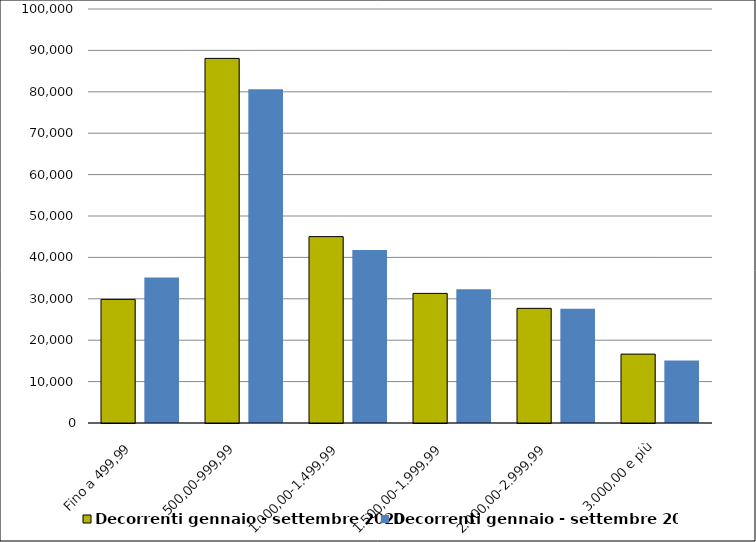
| Category | Decorrenti gennaio - settembre 2020 | Decorrenti gennaio - settembre 2019 |
|---|---|---|
| Fino a 499,99 | 29861 | 35146 |
| 500,00-999,99 | 88069 | 80629 |
| 1.000,00-1.499,99 | 45015 | 41802 |
| 1.500,00-1.999,99 | 31305 | 32307 |
| 2.000,00-2.999,99 | 27694 | 27585 |
| 3.000,00 e più | 16637 | 15113 |